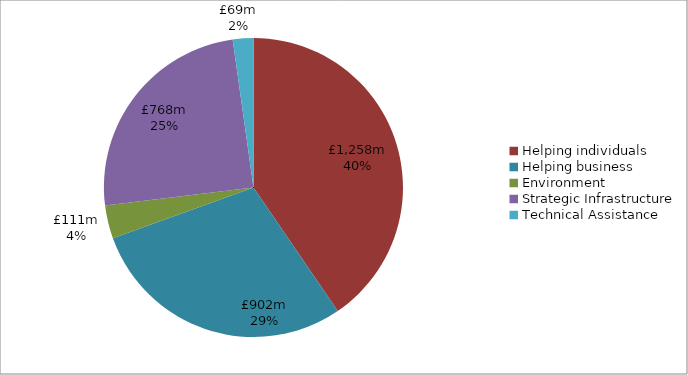
| Category | Series 0 | Series 1 |
|---|---|---|
| Helping individuals | 1258.392 |  |
| Helping business | 902.146 |  |
| Environment | 111.432 |  |
| Strategic Infrastructure | 768.23 |  |
| Technical Assistance | 69.185 |  |